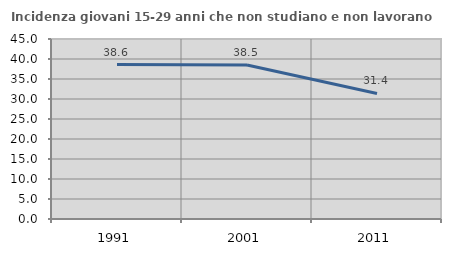
| Category | Incidenza giovani 15-29 anni che non studiano e non lavorano  |
|---|---|
| 1991.0 | 38.596 |
| 2001.0 | 38.516 |
| 2011.0 | 31.391 |